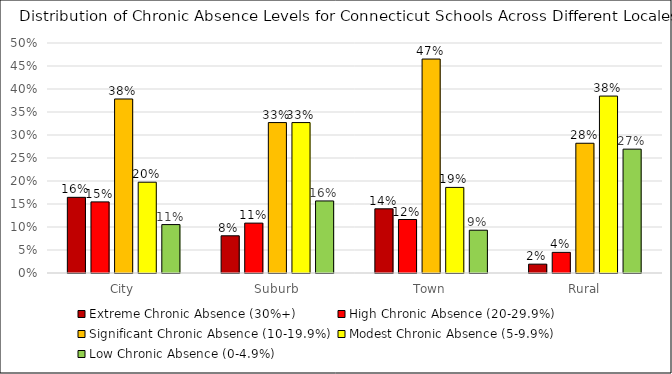
| Category | Extreme Chronic Absence (30%+) | High Chronic Absence (20-29.9%) | Significant Chronic Absence (10-19.9%) | Modest Chronic Absence (5-9.9%) | Low Chronic Absence (0-4.9%) |
|---|---|---|---|---|---|
| City | 0.164 | 0.155 | 0.378 | 0.197 | 0.105 |
| Suburb | 0.081 | 0.108 | 0.327 | 0.327 | 0.157 |
| Town | 0.14 | 0.116 | 0.465 | 0.186 | 0.093 |
| Rural | 0.019 | 0.045 | 0.282 | 0.385 | 0.269 |